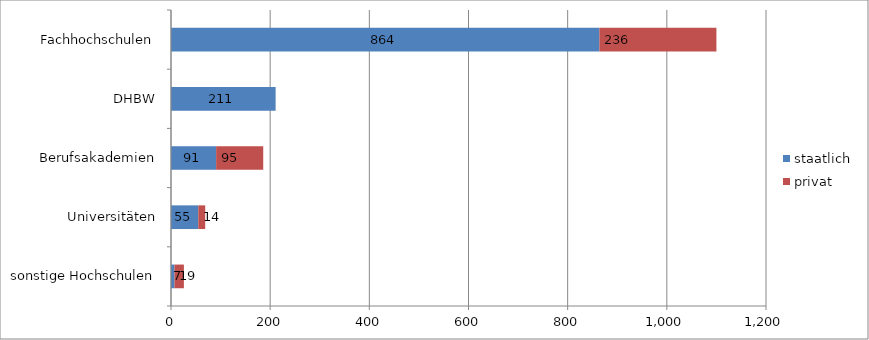
| Category | staatlich | privat |
|---|---|---|
| sonstige Hochschulen | 7 | 19 |
| Universitäten | 55 | 14 |
| Berufsakademien | 91 | 95 |
| DHBW | 211 | 0 |
| Fachhochschulen | 864 | 236 |